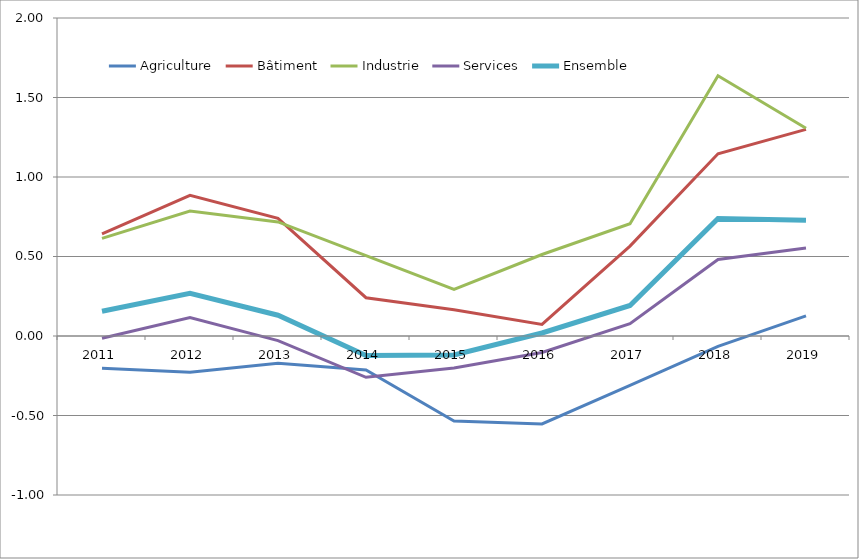
| Category | Agriculture | Bâtiment | Industrie | Services | Ensemble |
|---|---|---|---|---|---|
| 2011 | -0.203 | 0.643 | 0.614 | -0.014 | 0.155 |
| 2012 | -0.228 | 0.885 | 0.786 | 0.117 | 0.268 |
| 2013 | -0.171 | 0.74 | 0.717 | -0.029 | 0.131 |
| 2014 | -0.213 | 0.241 | 0.505 | -0.26 | -0.123 |
| 2015 | -0.535 | 0.165 | 0.294 | -0.201 | -0.12 |
| 2016 | -0.553 | 0.073 | 0.513 | -0.104 | 0.019 |
| 2017 | -0.31 | 0.565 | 0.706 | 0.078 | 0.192 |
| 2018 | -0.065 | 1.146 | 1.637 | 0.481 | 0.739 |
| 2019 | 0.127 | 1.3 | 1.307 | 0.553 | 0.728 |